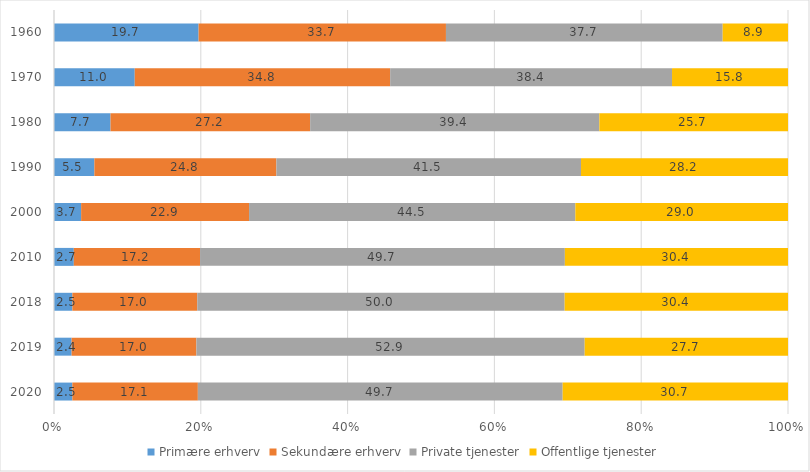
| Category | Primære erhverv | Sekundære erhverv | Private tjenester | Offentlige tjenester |
|---|---|---|---|---|
| 2020.0 | 2.5 | 17.1 | 49.7 | 30.7 |
| 2019.0 | 2.4 | 17 | 52.9 | 27.7 |
| 2018.0 | 2.5 | 17 | 50 | 30.4 |
| 2010.0 | 2.7 | 17.2 | 49.7 | 30.4 |
| 2000.0 | 3.7 | 22.9 | 44.5 | 29 |
| 1990.0 | 5.5 | 24.8 | 41.5 | 28.2 |
| 1980.0 | 7.7 | 27.2 | 39.4 | 25.7 |
| 1970.0 | 11 | 34.8 | 38.4 | 15.8 |
| 1960.0 | 19.7 | 33.7 | 37.7 | 8.9 |